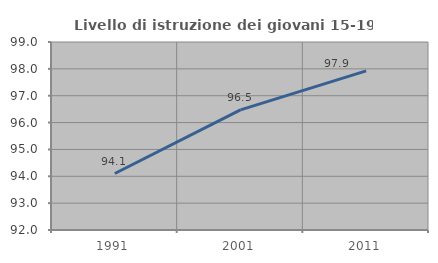
| Category | Livello di istruzione dei giovani 15-19 anni |
|---|---|
| 1991.0 | 94.102 |
| 2001.0 | 96.475 |
| 2011.0 | 97.925 |